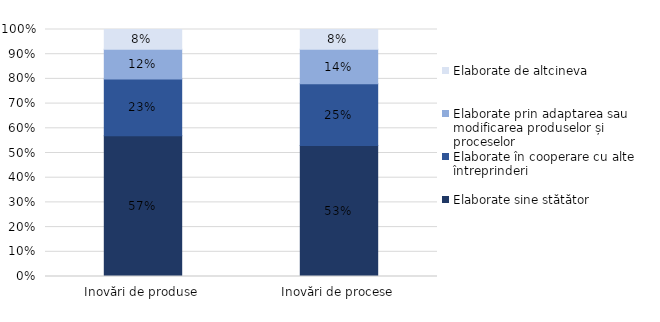
| Category | Elaborate sine stătător | Elaborate în cooperare cu alte întreprinderi  | Elaborate prin adaptarea sau modificarea produselor și proceselor | Elaborate de altcineva |
|---|---|---|---|---|
| Inovări de produse | 0.57 | 0.23 | 0.12 | 0.08 |
| Inovări de procese | 0.53 | 0.25 | 0.14 | 0.08 |